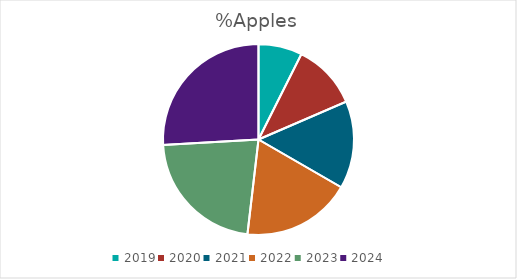
| Category | %Apples |
|---|---|
| 2019.0 | 10 |
| 2020.0 | 15 |
| 2021.0 | 20 |
| 2022.0 | 25 |
| 2023.0 | 30 |
| 2024.0 | 35 |